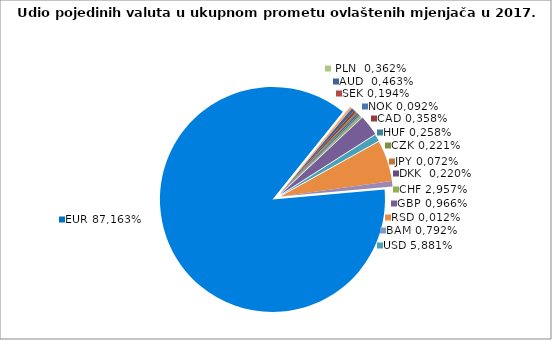
| Category | AUD |
|---|---|
| 0 | 0.005 |
| 1 | 0.004 |
| 2 | 0.002 |
| 3 | 0.002 |
| 4 | 0.003 |
| 5 | 0.001 |
| 6 | 0.001 |
| 7 | 0 |
| 8 | 0.002 |
| 9 | 0.03 |
| 10 | 0.01 |
| 11 | 0.059 |
| 12 | 0 |
| 13 | 0 |
| 14 | 0 |
| 15 | 0.008 |
| 16 | 0.872 |
| 17 | 0.003 |